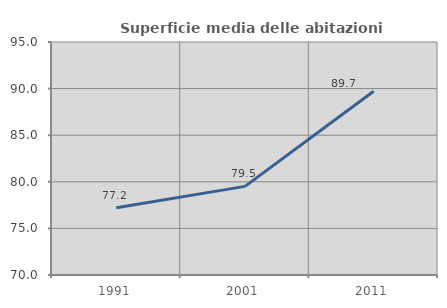
| Category | Superficie media delle abitazioni occupate |
|---|---|
| 1991.0 | 77.215 |
| 2001.0 | 79.509 |
| 2011.0 | 89.713 |